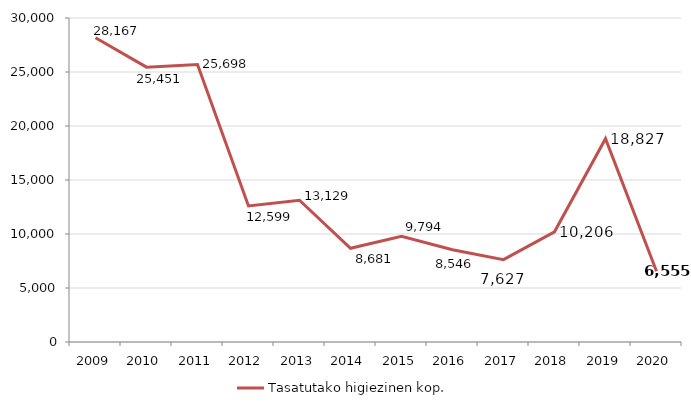
| Category | Tasatutako higiezinen kop. |
|---|---|
| 2009.0 | 28167 |
| 2010.0 | 25451 |
| 2011.0 | 25698 |
| 2012.0 | 12599 |
| 2013.0 | 13129 |
| 2014.0 | 8681 |
| 2015.0 | 9793.5 |
| 2016.0 | 8546 |
| 2017.0 | 7627 |
| 2018.0 | 10206 |
| 2019.0 | 18827 |
| 2020.0 | 6555 |